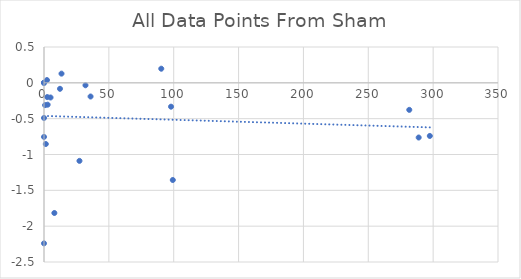
| Category | All Data Points From Sham |
|---|---|
| 281.6 | -0.377 |
| 97.93 | -0.333 |
| 35.9 | -0.191 |
| 13.5 | 0.128 |
| 5.05 | -0.205 |
| 2.29 | 0.038 |
| 0.0 | 0 |
| 0.0 | -0.49 |
| 297.435 | -0.741 |
| 99.29 | -1.356 |
| 27.345 | -1.089 |
| 7.99 | -1.816 |
| 2.82 | -0.305 |
| 1.385 | -0.854 |
| 0.0 | 0 |
| 0.0 | -2.24 |
| 288.85 | -0.763 |
| 90.4 | 0.197 |
| 31.98 | -0.034 |
| 12.33 | -0.083 |
| 2.49 | -0.199 |
| 0.82 | -0.311 |
| 0.0 | 0 |
| 0.0 | -0.754 |